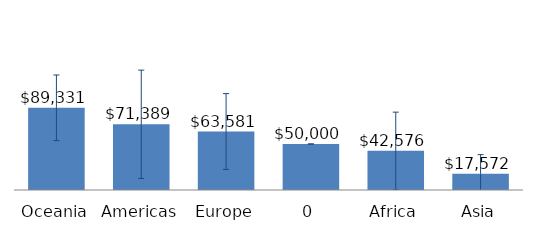
| Category | Total |
|---|---|
| Oceania | 89331.056 |
| Americas | 71388.879 |
| Europe | 63581.414 |
| #N/A | 50000 |
| Africa | 42575.941 |
| Asia | 17572.413 |